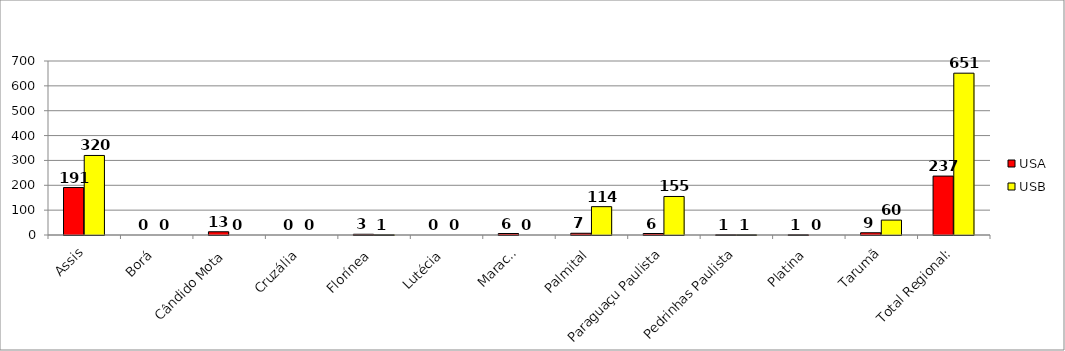
| Category | USA | USB |
|---|---|---|
| Assis | 191 | 320 |
| Borá | 0 | 0 |
| Cândido Mota | 13 | 0 |
| Cruzália | 0 | 0 |
| Florínea | 3 | 1 |
| Lutécia | 0 | 0 |
| Maracaí | 6 | 0 |
| Palmital | 7 | 114 |
| Paraguaçu Paulista | 6 | 155 |
| Pedrinhas Paulista | 1 | 1 |
| Platina | 1 | 0 |
| Tarumã | 9 | 60 |
| Total Regional: | 237 | 651 |